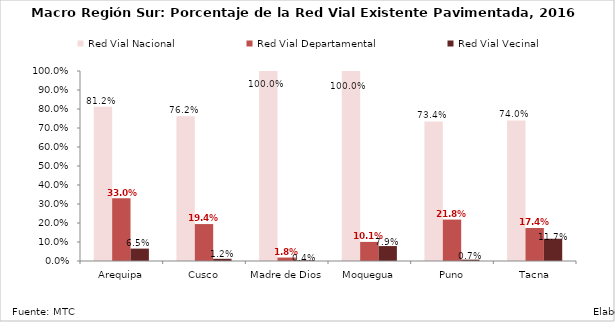
| Category | Red Vial Nacional | Red Vial Departamental | Red Vial Vecinal |
|---|---|---|---|
|  Arequipa | 0.812 | 0.33 | 0.065 |
|  Cusco | 0.762 | 0.194 | 0.012 |
|  Madre de Dios | 1 | 0.018 | 0.004 |
|  Moquegua | 1 | 0.101 | 0.079 |
|  Puno | 0.734 | 0.218 | 0.007 |
|  Tacna | 0.74 | 0.174 | 0.117 |